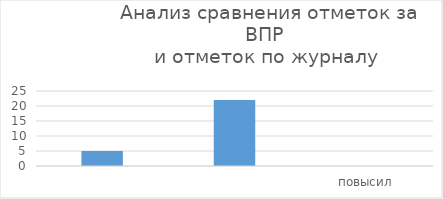
| Category | Series 0 |
|---|---|
|  | 5 |
|  | 22 |
| повысил | 0 |